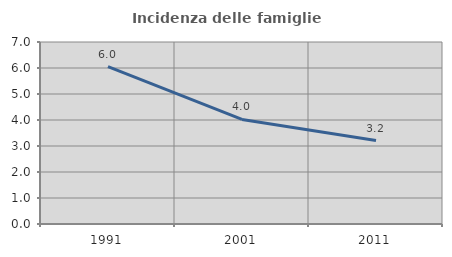
| Category | Incidenza delle famiglie numerose |
|---|---|
| 1991.0 | 6.049 |
| 2001.0 | 4.023 |
| 2011.0 | 3.212 |